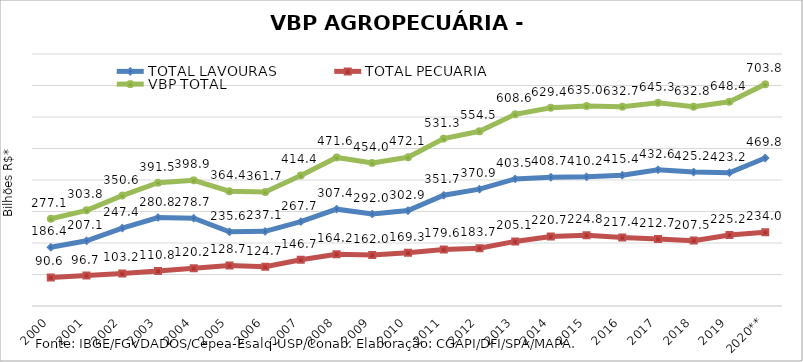
| Category | TOTAL LAVOURAS | TOTAL PECUÁRIA | VBP TOTAL |
|---|---|---|---|
| 2000 | 186.431 | 90.622 | 277.054 |
| 2001 | 207.091 | 96.683 | 303.773 |
| 2002 | 247.377 | 103.209 | 350.586 |
| 2003 | 280.771 | 110.777 | 391.548 |
| 2004 | 278.715 | 120.162 | 398.877 |
| 2005 | 235.641 | 128.722 | 364.364 |
| 2006 | 237.081 | 124.669 | 361.75 |
| 2007 | 267.74 | 146.666 | 414.406 |
| 2008 | 307.431 | 164.154 | 471.586 |
| 2009 | 292.019 | 162.019 | 454.038 |
| 2010 | 302.856 | 169.279 | 472.135 |
| 2011 | 351.73 | 179.562 | 531.291 |
| 2012 | 370.856 | 183.681 | 554.537 |
| 2013 | 403.494 | 205.057 | 608.552 |
| 2014 | 408.685 | 220.7 | 629.386 |
| 2015 | 410.168 | 224.833 | 635.001 |
| 2016 | 415.355 | 217.357 | 632.712 |
| 2017 | 432.612 | 212.687 | 645.299 |
| 2018 | 425.216 | 207.543 | 632.76 |
| 2019 | 423.179 | 225.235 | 648.414 |
| 2020** | 469.809 | 233.996 | 703.805 |